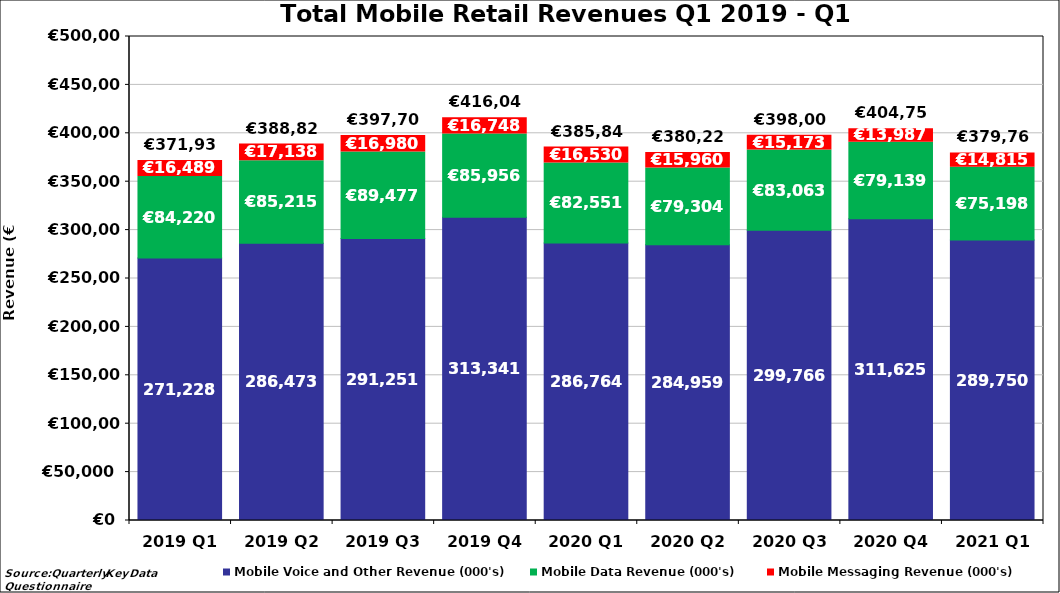
| Category | Mobile Voice and Other Revenue (000's) | Mobile Data Revenue (000's) | Mobile Messaging Revenue (000's) |
|---|---|---|---|
| 2019 Q1 | 271228.262 | 84220.478 | 16488.962 |
| 2019 Q2 | 286472.553 | 85214.89 | 17138.438 |
| 2019 Q3 | 291250.878 | 89477.355 | 16980.077 |
| 2019 Q4 | 313340.616 | 85955.659 | 16747.708 |
| 2020 Q1 | 286764 | 82551 | 16530.453 |
| 2020 Q2 | 284959 | 79304 | 15960 |
| 2020 Q3 | 299766 | 83063 | 15173 |
| 2020 Q4 | 311625.153 | 79139.116 | 13986.661 |
| 2021 Q1 | 289750.194 | 75197.694 | 14815.333 |